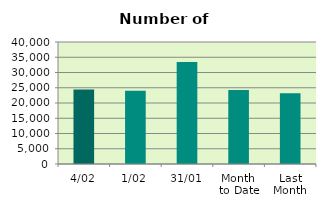
| Category | Series 0 |
|---|---|
| 4/02 | 24430 |
| 1/02 | 24032 |
| 31/01 | 33464 |
| Month 
to Date | 24231 |
| Last
Month | 23216.727 |